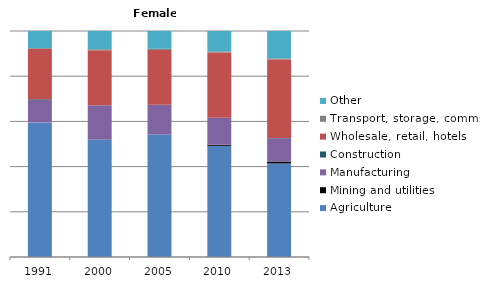
| Category | Agriculture | Mining and utilities | Manufacturing | Construction | Wholesale, retail, hotels | Transport, storage, comms | Other |
|---|---|---|---|---|---|---|---|
| 1991.0 | 59.5 | 0 | 9.9 | 0.3 | 22.3 | 0.3 | 7.6 |
| 2000.0 | 52 | 0 | 15.2 | 0 | 24.4 | 0.4 | 8.1 |
| 2005.0 | 54.3 | 0 | 13.2 | 0 | 24.3 | 0.5 | 7.9 |
| 2010.0 | 49.2 | 0.5 | 11.8 | 0.1 | 28.9 | 0.5 | 9 |
| 2013.0 | 41.4 | 0.8 | 10.3 | 0.2 | 34.7 | 0.5 | 12.1 |